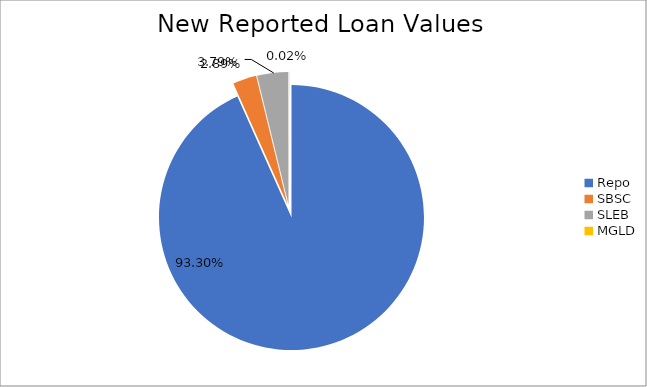
| Category | Series 0 |
|---|---|
| Repo | 9451971.782 |
| SBSC | 292768.907 |
| SLEB | 383547.355 |
| MGLD | 2242.798 |